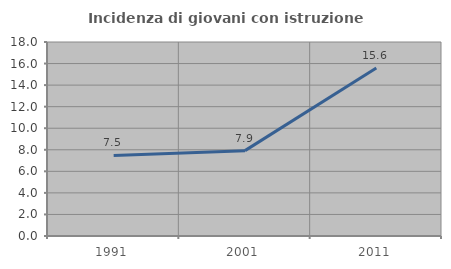
| Category | Incidenza di giovani con istruzione universitaria |
|---|---|
| 1991.0 | 7.477 |
| 2001.0 | 7.921 |
| 2011.0 | 15.596 |